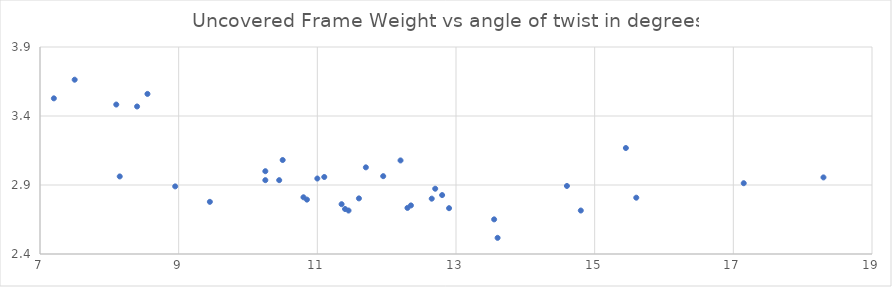
| Category | Series 0 |
|---|---|
| 13.599999999999998 | 2.517 |
| 11.45 | 2.715 |
| 8.95 | 2.89 |
| 12.3 | 2.734 |
| 11.35 | 2.761 |
| 11.1 | 2.958 |
| 11.6 | 2.803 |
| 10.85 | 2.794 |
| 10.450000000000001 | 2.935 |
| 10.25 | 2.935 |
| 13.549999999999999 | 2.651 |
| 10.8 | 2.811 |
| 11.4 | 2.726 |
| 12.7 | 2.873 |
| 12.35 | 2.752 |
| 12.799999999999999 | 2.827 |
| 12.899999999999999 | 2.732 |
| 11.950000000000001 | 2.964 |
| 12.2 | 3.078 |
| 15.450000000000001 | 3.168 |
| 18.3 | 2.955 |
| 12.65 | 2.801 |
| 8.55 | 3.56 |
| 15.600000000000001 | 2.808 |
| 17.15 | 2.913 |
| 14.6 | 2.893 |
| 11.0 | 2.947 |
| 11.700000000000001 | 3.028 |
| 10.25 | 3 |
| 7.2 | 3.528 |
| 7.5 | 3.663 |
| 8.1 | 3.483 |
| 8.4 | 3.469 |
| 9.45 | 2.778 |
| 14.8 | 2.715 |
| 10.5 | 3.081 |
| 8.15 | 2.962 |